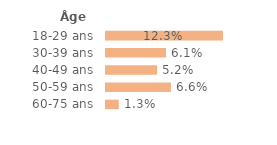
| Category | Series 0 |
|---|---|
| 18-29 ans | 0.123 |
| 30-39 ans | 0.061 |
| 40-49 ans | 0.052 |
| 50-59 ans | 0.066 |
| 60-75 ans | 0.013 |